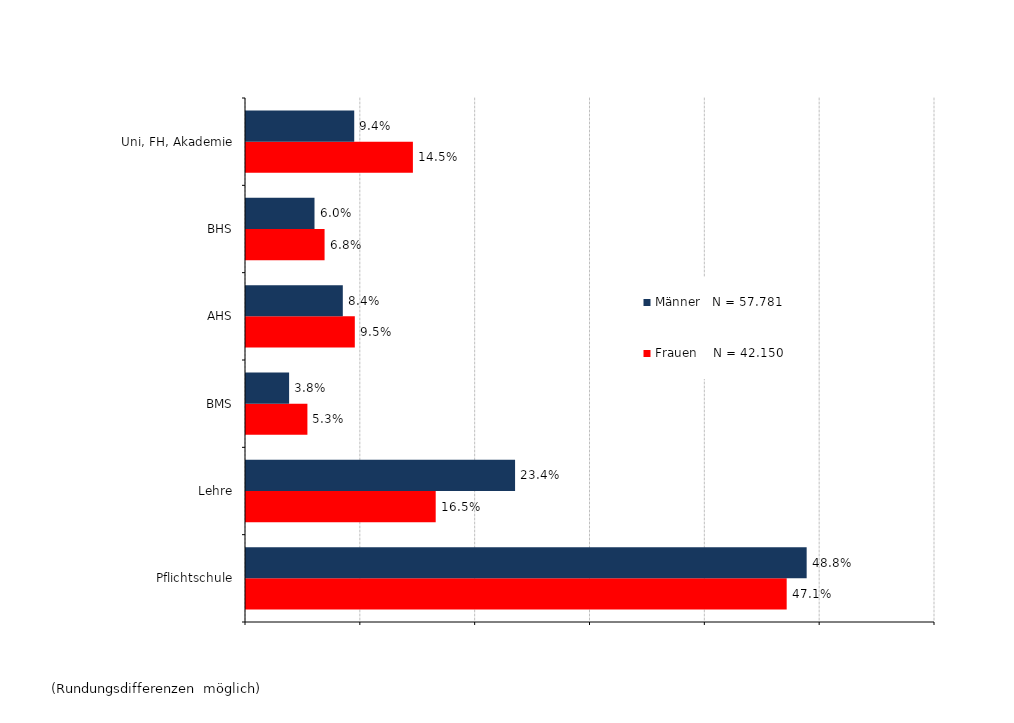
| Category | Frauen    N = 42.150 | Männer   N = 57.781 |
|---|---|---|
| Pflichtschule | 0.471 | 0.488 |
| Lehre | 0.165 | 0.234 |
| BMS | 0.053 | 0.038 |
| AHS | 0.095 | 0.084 |
| BHS | 0.068 | 0.06 |
| Uni, FH, Akademie | 0.145 | 0.094 |